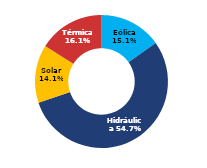
| Category | Sur |
|---|---|
| Eólica | 72.408 |
| Hidráulica | 261.391 |
| Solar | 67.429 |
| Térmica | 76.729 |